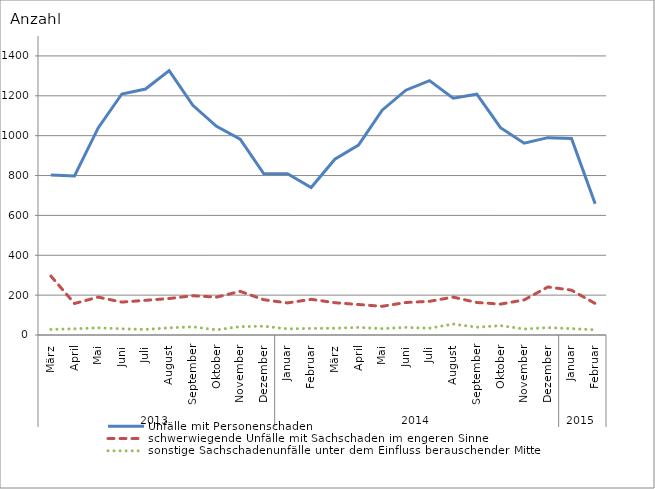
| Category | Unfälle mit Personenschaden | schwerwiegende Unfälle mit Sachschaden im engeren Sinne | sonstige Sachschadenunfälle unter dem Einfluss berauschender Mittel |
|---|---|---|---|
| 0 | 803 | 296 | 28 |
| 1 | 798 | 158 | 31 |
| 2 | 1039 | 190 | 36 |
| 3 | 1209 | 165 | 31 |
| 4 | 1234 | 174 | 28 |
| 5 | 1326 | 183 | 36 |
| 6 | 1152 | 197 | 41 |
| 7 | 1047 | 190 | 26 |
| 8 | 983 | 219 | 42 |
| 9 | 809 | 177 | 44 |
| 10 | 809 | 161 | 31 |
| 11 | 740 | 179 | 33 |
| 12 | 882 | 162 | 34 |
| 13 | 953 | 153 | 38 |
| 14 | 1128 | 144 | 32 |
| 15 | 1228 | 163 | 38 |
| 16 | 1276 | 169 | 34 |
| 17 | 1188 | 190 | 55 |
| 18 | 1208 | 163 | 39 |
| 19 | 1040 | 155 | 47 |
| 20 | 962 | 176 | 30 |
| 21 | 990 | 241 | 37 |
| 22 | 986 | 225 | 32 |
| 23 | 658 | 158 | 26 |